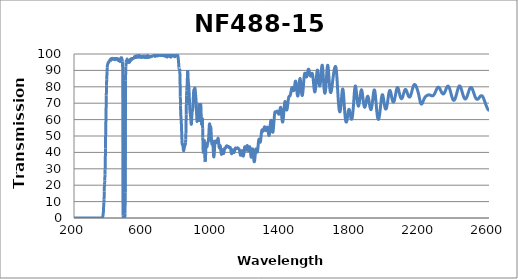
| Category | Transmission (%) |
|---|---|
| 2600.0 | 65.668 |
| 2599.0 | 65.684 |
| 2598.0 | 65.74 |
| 2597.0 | 65.794 |
| 2596.0 | 65.905 |
| 2595.0 | 66.047 |
| 2594.0 | 66.186 |
| 2593.0 | 66.374 |
| 2592.0 | 66.549 |
| 2591.0 | 66.769 |
| 2590.0 | 66.969 |
| 2589.0 | 67.181 |
| 2588.0 | 67.409 |
| 2587.0 | 67.704 |
| 2586.0 | 67.999 |
| 2585.0 | 68.207 |
| 2584.0 | 68.492 |
| 2583.0 | 68.764 |
| 2582.0 | 69.066 |
| 2581.0 | 69.389 |
| 2580.0 | 69.69 |
| 2579.0 | 69.988 |
| 2578.0 | 70.286 |
| 2577.0 | 70.584 |
| 2576.0 | 70.84 |
| 2575.0 | 71.145 |
| 2574.0 | 71.443 |
| 2573.0 | 71.683 |
| 2572.0 | 71.966 |
| 2571.0 | 72.23 |
| 2570.0 | 72.528 |
| 2569.0 | 72.798 |
| 2568.0 | 73.08 |
| 2567.0 | 73.34 |
| 2566.0 | 73.554 |
| 2565.0 | 73.762 |
| 2564.0 | 73.942 |
| 2563.0 | 74.112 |
| 2562.0 | 74.261 |
| 2561.0 | 74.375 |
| 2560.0 | 74.443 |
| 2559.0 | 74.502 |
| 2558.0 | 74.571 |
| 2557.0 | 74.596 |
| 2556.0 | 74.603 |
| 2555.0 | 74.603 |
| 2554.0 | 74.546 |
| 2553.0 | 74.491 |
| 2552.0 | 74.447 |
| 2551.0 | 74.345 |
| 2550.0 | 74.24 |
| 2549.0 | 74.157 |
| 2548.0 | 74.02 |
| 2547.0 | 73.843 |
| 2546.0 | 73.702 |
| 2545.0 | 73.576 |
| 2544.0 | 73.45 |
| 2543.0 | 73.312 |
| 2542.0 | 73.132 |
| 2541.0 | 72.984 |
| 2540.0 | 72.856 |
| 2539.0 | 72.773 |
| 2538.0 | 72.678 |
| 2537.0 | 72.597 |
| 2536.0 | 72.52 |
| 2535.0 | 72.45 |
| 2534.0 | 72.405 |
| 2533.0 | 72.385 |
| 2532.0 | 72.358 |
| 2531.0 | 72.353 |
| 2530.0 | 72.377 |
| 2529.0 | 72.429 |
| 2528.0 | 72.501 |
| 2527.0 | 72.619 |
| 2526.0 | 72.739 |
| 2525.0 | 72.878 |
| 2524.0 | 72.994 |
| 2523.0 | 73.16 |
| 2522.0 | 73.359 |
| 2521.0 | 73.58 |
| 2520.0 | 73.802 |
| 2519.0 | 74.068 |
| 2518.0 | 74.348 |
| 2517.0 | 74.641 |
| 2516.0 | 74.943 |
| 2515.0 | 75.262 |
| 2514.0 | 75.579 |
| 2513.0 | 75.898 |
| 2512.0 | 76.214 |
| 2511.0 | 76.527 |
| 2510.0 | 76.812 |
| 2509.0 | 77.129 |
| 2508.0 | 77.443 |
| 2507.0 | 77.738 |
| 2506.0 | 78.048 |
| 2505.0 | 78.302 |
| 2504.0 | 78.562 |
| 2503.0 | 78.792 |
| 2502.0 | 79.015 |
| 2501.0 | 79.195 |
| 2500.0 | 79.356 |
| 2499.0 | 79.455 |
| 2498.0 | 79.515 |
| 2497.0 | 79.581 |
| 2496.0 | 79.594 |
| 2495.0 | 79.607 |
| 2494.0 | 79.561 |
| 2493.0 | 79.493 |
| 2492.0 | 79.401 |
| 2491.0 | 79.265 |
| 2490.0 | 79.1 |
| 2489.0 | 78.941 |
| 2488.0 | 78.728 |
| 2487.0 | 78.483 |
| 2486.0 | 78.211 |
| 2485.0 | 77.928 |
| 2484.0 | 77.635 |
| 2483.0 | 77.314 |
| 2482.0 | 77.004 |
| 2481.0 | 76.682 |
| 2480.0 | 76.348 |
| 2479.0 | 76.006 |
| 2478.0 | 75.674 |
| 2477.0 | 75.333 |
| 2476.0 | 75.038 |
| 2475.0 | 74.734 |
| 2474.0 | 74.424 |
| 2473.0 | 74.117 |
| 2472.0 | 73.839 |
| 2471.0 | 73.573 |
| 2470.0 | 73.337 |
| 2469.0 | 73.155 |
| 2468.0 | 73.011 |
| 2467.0 | 72.866 |
| 2466.0 | 72.741 |
| 2465.0 | 72.637 |
| 2464.0 | 72.578 |
| 2463.0 | 72.577 |
| 2462.0 | 72.591 |
| 2461.0 | 72.631 |
| 2460.0 | 72.699 |
| 2459.0 | 72.811 |
| 2458.0 | 72.94 |
| 2457.0 | 73.11 |
| 2456.0 | 73.313 |
| 2455.0 | 73.518 |
| 2454.0 | 73.745 |
| 2453.0 | 74.009 |
| 2452.0 | 74.286 |
| 2451.0 | 74.601 |
| 2450.0 | 74.939 |
| 2449.0 | 75.282 |
| 2448.0 | 75.632 |
| 2447.0 | 75.988 |
| 2446.0 | 76.345 |
| 2445.0 | 76.72 |
| 2444.0 | 77.119 |
| 2443.0 | 77.505 |
| 2442.0 | 77.866 |
| 2441.0 | 78.23 |
| 2440.0 | 78.582 |
| 2439.0 | 78.904 |
| 2438.0 | 79.225 |
| 2437.0 | 79.519 |
| 2436.0 | 79.781 |
| 2435.0 | 80.007 |
| 2434.0 | 80.189 |
| 2433.0 | 80.339 |
| 2432.0 | 80.444 |
| 2431.0 | 80.52 |
| 2430.0 | 80.565 |
| 2429.0 | 80.544 |
| 2428.0 | 80.47 |
| 2427.0 | 80.347 |
| 2426.0 | 80.187 |
| 2425.0 | 80.012 |
| 2424.0 | 79.811 |
| 2423.0 | 79.557 |
| 2422.0 | 79.254 |
| 2421.0 | 78.933 |
| 2420.0 | 78.587 |
| 2419.0 | 78.217 |
| 2418.0 | 77.843 |
| 2417.0 | 77.45 |
| 2416.0 | 77.058 |
| 2415.0 | 76.661 |
| 2414.0 | 76.23 |
| 2413.0 | 75.806 |
| 2412.0 | 75.399 |
| 2411.0 | 75.019 |
| 2410.0 | 74.673 |
| 2409.0 | 74.315 |
| 2408.0 | 73.938 |
| 2407.0 | 73.595 |
| 2406.0 | 73.277 |
| 2405.0 | 72.981 |
| 2404.0 | 72.727 |
| 2403.0 | 72.512 |
| 2402.0 | 72.314 |
| 2401.0 | 72.12 |
| 2400.0 | 71.966 |
| 2399.0 | 71.87 |
| 2398.0 | 71.815 |
| 2397.0 | 71.79 |
| 2396.0 | 71.794 |
| 2395.0 | 71.832 |
| 2394.0 | 71.901 |
| 2393.0 | 72.006 |
| 2392.0 | 72.142 |
| 2391.0 | 72.322 |
| 2390.0 | 72.545 |
| 2389.0 | 72.805 |
| 2388.0 | 73.093 |
| 2387.0 | 73.394 |
| 2386.0 | 73.706 |
| 2385.0 | 74.043 |
| 2384.0 | 74.412 |
| 2383.0 | 74.787 |
| 2382.0 | 75.164 |
| 2381.0 | 75.565 |
| 2380.0 | 75.962 |
| 2379.0 | 76.368 |
| 2378.0 | 76.778 |
| 2377.0 | 77.186 |
| 2376.0 | 77.571 |
| 2375.0 | 77.932 |
| 2374.0 | 78.286 |
| 2373.0 | 78.638 |
| 2372.0 | 78.973 |
| 2371.0 | 79.287 |
| 2370.0 | 79.522 |
| 2369.0 | 79.723 |
| 2368.0 | 79.909 |
| 2367.0 | 80.077 |
| 2366.0 | 80.215 |
| 2365.0 | 80.334 |
| 2364.0 | 80.411 |
| 2363.0 | 80.437 |
| 2362.0 | 80.417 |
| 2361.0 | 80.37 |
| 2360.0 | 80.287 |
| 2359.0 | 80.184 |
| 2358.0 | 80.058 |
| 2357.0 | 79.887 |
| 2356.0 | 79.696 |
| 2355.0 | 79.484 |
| 2354.0 | 79.221 |
| 2353.0 | 78.97 |
| 2352.0 | 78.721 |
| 2351.0 | 78.455 |
| 2350.0 | 78.184 |
| 2349.0 | 77.905 |
| 2348.0 | 77.635 |
| 2347.0 | 77.384 |
| 2346.0 | 77.136 |
| 2345.0 | 76.896 |
| 2344.0 | 76.677 |
| 2343.0 | 76.468 |
| 2342.0 | 76.282 |
| 2341.0 | 76.125 |
| 2340.0 | 75.978 |
| 2339.0 | 75.867 |
| 2338.0 | 75.777 |
| 2337.0 | 75.701 |
| 2336.0 | 75.665 |
| 2335.0 | 75.641 |
| 2334.0 | 75.666 |
| 2333.0 | 75.715 |
| 2332.0 | 75.801 |
| 2331.0 | 75.889 |
| 2330.0 | 75.966 |
| 2329.0 | 76.085 |
| 2328.0 | 76.218 |
| 2327.0 | 76.397 |
| 2326.0 | 76.617 |
| 2325.0 | 76.819 |
| 2324.0 | 77.015 |
| 2323.0 | 77.222 |
| 2322.0 | 77.435 |
| 2321.0 | 77.662 |
| 2320.0 | 77.899 |
| 2319.0 | 78.158 |
| 2318.0 | 78.41 |
| 2317.0 | 78.622 |
| 2316.0 | 78.823 |
| 2315.0 | 78.999 |
| 2314.0 | 79.189 |
| 2313.0 | 79.346 |
| 2312.0 | 79.484 |
| 2311.0 | 79.628 |
| 2310.0 | 79.697 |
| 2309.0 | 79.741 |
| 2308.0 | 79.75 |
| 2307.0 | 79.758 |
| 2306.0 | 79.759 |
| 2305.0 | 79.703 |
| 2304.0 | 79.613 |
| 2303.0 | 79.542 |
| 2302.0 | 79.419 |
| 2301.0 | 79.265 |
| 2300.0 | 79.082 |
| 2299.0 | 78.914 |
| 2298.0 | 78.705 |
| 2297.0 | 78.472 |
| 2296.0 | 78.245 |
| 2295.0 | 78.013 |
| 2294.0 | 77.78 |
| 2293.0 | 77.56 |
| 2292.0 | 77.332 |
| 2291.0 | 77.077 |
| 2290.0 | 76.838 |
| 2289.0 | 76.574 |
| 2288.0 | 76.349 |
| 2287.0 | 76.118 |
| 2286.0 | 75.925 |
| 2285.0 | 75.739 |
| 2284.0 | 75.55 |
| 2283.0 | 75.338 |
| 2282.0 | 75.189 |
| 2281.0 | 75.037 |
| 2280.0 | 74.928 |
| 2279.0 | 74.804 |
| 2278.0 | 74.702 |
| 2277.0 | 74.629 |
| 2276.0 | 74.57 |
| 2275.0 | 74.517 |
| 2274.0 | 74.481 |
| 2273.0 | 74.467 |
| 2272.0 | 74.471 |
| 2271.0 | 74.454 |
| 2270.0 | 74.495 |
| 2269.0 | 74.492 |
| 2268.0 | 74.524 |
| 2267.0 | 74.583 |
| 2266.0 | 74.66 |
| 2265.0 | 74.712 |
| 2264.0 | 74.754 |
| 2263.0 | 74.83 |
| 2262.0 | 74.857 |
| 2261.0 | 74.913 |
| 2260.0 | 74.949 |
| 2259.0 | 74.973 |
| 2258.0 | 75.001 |
| 2257.0 | 75.016 |
| 2256.0 | 75.018 |
| 2255.0 | 75.04 |
| 2254.0 | 75.052 |
| 2253.0 | 75.081 |
| 2252.0 | 75.09 |
| 2251.0 | 75.042 |
| 2250.0 | 75.02 |
| 2249.0 | 74.996 |
| 2248.0 | 74.967 |
| 2247.0 | 74.963 |
| 2246.0 | 74.947 |
| 2245.0 | 74.889 |
| 2244.0 | 74.808 |
| 2243.0 | 74.766 |
| 2242.0 | 74.719 |
| 2241.0 | 74.674 |
| 2240.0 | 74.61 |
| 2239.0 | 74.554 |
| 2238.0 | 74.479 |
| 2237.0 | 74.382 |
| 2236.0 | 74.31 |
| 2235.0 | 74.235 |
| 2234.0 | 74.141 |
| 2233.0 | 74.039 |
| 2232.0 | 73.905 |
| 2231.0 | 73.759 |
| 2230.0 | 73.624 |
| 2229.0 | 73.452 |
| 2228.0 | 73.281 |
| 2227.0 | 73.106 |
| 2226.0 | 72.911 |
| 2225.0 | 72.695 |
| 2224.0 | 72.451 |
| 2223.0 | 72.182 |
| 2222.0 | 71.929 |
| 2221.0 | 71.682 |
| 2220.0 | 71.411 |
| 2219.0 | 71.13 |
| 2218.0 | 70.876 |
| 2217.0 | 70.608 |
| 2216.0 | 70.393 |
| 2215.0 | 70.158 |
| 2214.0 | 69.957 |
| 2213.0 | 69.779 |
| 2212.0 | 69.646 |
| 2211.0 | 69.523 |
| 2210.0 | 69.44 |
| 2209.0 | 69.437 |
| 2208.0 | 69.509 |
| 2207.0 | 69.62 |
| 2206.0 | 69.799 |
| 2205.0 | 70.027 |
| 2204.0 | 70.287 |
| 2203.0 | 70.636 |
| 2202.0 | 71.03 |
| 2201.0 | 71.459 |
| 2200.0 | 71.949 |
| 2199.0 | 72.453 |
| 2198.0 | 72.921 |
| 2197.0 | 73.437 |
| 2196.0 | 73.984 |
| 2195.0 | 74.483 |
| 2194.0 | 74.942 |
| 2193.0 | 75.407 |
| 2192.0 | 75.798 |
| 2191.0 | 76.24 |
| 2190.0 | 76.62 |
| 2189.0 | 77.04 |
| 2188.0 | 77.394 |
| 2187.0 | 77.769 |
| 2186.0 | 78.088 |
| 2185.0 | 78.403 |
| 2184.0 | 78.724 |
| 2183.0 | 79.033 |
| 2182.0 | 79.329 |
| 2181.0 | 79.635 |
| 2180.0 | 79.872 |
| 2179.0 | 80.127 |
| 2178.0 | 80.356 |
| 2177.0 | 80.603 |
| 2176.0 | 80.773 |
| 2175.0 | 80.943 |
| 2174.0 | 81.101 |
| 2173.0 | 81.223 |
| 2172.0 | 81.293 |
| 2171.0 | 81.336 |
| 2170.0 | 81.362 |
| 2169.0 | 81.354 |
| 2168.0 | 81.332 |
| 2167.0 | 81.277 |
| 2166.0 | 81.142 |
| 2165.0 | 80.98 |
| 2164.0 | 80.777 |
| 2163.0 | 80.548 |
| 2162.0 | 80.275 |
| 2161.0 | 79.961 |
| 2160.0 | 79.627 |
| 2159.0 | 79.245 |
| 2158.0 | 78.893 |
| 2157.0 | 78.51 |
| 2156.0 | 78.103 |
| 2155.0 | 77.69 |
| 2154.0 | 77.241 |
| 2153.0 | 76.831 |
| 2152.0 | 76.452 |
| 2151.0 | 76.052 |
| 2150.0 | 75.695 |
| 2149.0 | 75.327 |
| 2148.0 | 75.031 |
| 2147.0 | 74.747 |
| 2146.0 | 74.483 |
| 2145.0 | 74.26 |
| 2144.0 | 74.089 |
| 2143.0 | 73.972 |
| 2142.0 | 73.845 |
| 2141.0 | 73.766 |
| 2140.0 | 73.753 |
| 2139.0 | 73.754 |
| 2138.0 | 73.834 |
| 2137.0 | 73.928 |
| 2136.0 | 74.047 |
| 2135.0 | 74.218 |
| 2134.0 | 74.427 |
| 2133.0 | 74.636 |
| 2132.0 | 74.886 |
| 2131.0 | 75.17 |
| 2130.0 | 75.484 |
| 2129.0 | 75.755 |
| 2128.0 | 76.033 |
| 2127.0 | 76.312 |
| 2126.0 | 76.631 |
| 2125.0 | 76.982 |
| 2124.0 | 77.257 |
| 2123.0 | 77.508 |
| 2122.0 | 77.75 |
| 2121.0 | 77.967 |
| 2120.0 | 78.139 |
| 2119.0 | 78.25 |
| 2118.0 | 78.327 |
| 2117.0 | 78.381 |
| 2116.0 | 78.333 |
| 2115.0 | 78.265 |
| 2114.0 | 78.133 |
| 2113.0 | 77.955 |
| 2112.0 | 77.753 |
| 2111.0 | 77.489 |
| 2110.0 | 77.206 |
| 2109.0 | 76.863 |
| 2108.0 | 76.499 |
| 2107.0 | 76.132 |
| 2106.0 | 75.786 |
| 2105.0 | 75.396 |
| 2104.0 | 75.026 |
| 2103.0 | 74.631 |
| 2102.0 | 74.28 |
| 2101.0 | 73.951 |
| 2100.0 | 73.668 |
| 2099.0 | 73.406 |
| 2098.0 | 73.187 |
| 2097.0 | 72.988 |
| 2096.0 | 72.863 |
| 2095.0 | 72.768 |
| 2094.0 | 72.744 |
| 2093.0 | 72.778 |
| 2092.0 | 72.842 |
| 2091.0 | 72.946 |
| 2090.0 | 73.11 |
| 2089.0 | 73.337 |
| 2088.0 | 73.581 |
| 2087.0 | 73.88 |
| 2086.0 | 74.223 |
| 2085.0 | 74.621 |
| 2084.0 | 75.032 |
| 2083.0 | 75.495 |
| 2082.0 | 75.916 |
| 2081.0 | 76.379 |
| 2080.0 | 76.861 |
| 2079.0 | 77.328 |
| 2078.0 | 77.766 |
| 2077.0 | 78.173 |
| 2076.0 | 78.551 |
| 2075.0 | 78.884 |
| 2074.0 | 79.144 |
| 2073.0 | 79.345 |
| 2072.0 | 79.482 |
| 2071.0 | 79.532 |
| 2070.0 | 79.486 |
| 2069.0 | 79.382 |
| 2068.0 | 79.182 |
| 2067.0 | 78.9 |
| 2066.0 | 78.563 |
| 2065.0 | 78.164 |
| 2064.0 | 77.702 |
| 2063.0 | 77.195 |
| 2062.0 | 76.643 |
| 2061.0 | 76.087 |
| 2060.0 | 75.527 |
| 2059.0 | 74.936 |
| 2058.0 | 74.354 |
| 2057.0 | 73.763 |
| 2056.0 | 73.213 |
| 2055.0 | 72.724 |
| 2054.0 | 72.28 |
| 2053.0 | 71.877 |
| 2052.0 | 71.514 |
| 2051.0 | 71.207 |
| 2050.0 | 70.974 |
| 2049.0 | 70.807 |
| 2048.0 | 70.706 |
| 2047.0 | 70.681 |
| 2046.0 | 70.728 |
| 2045.0 | 70.828 |
| 2044.0 | 70.99 |
| 2043.0 | 71.229 |
| 2042.0 | 71.564 |
| 2041.0 | 71.964 |
| 2040.0 | 72.373 |
| 2039.0 | 72.804 |
| 2038.0 | 73.291 |
| 2037.0 | 73.838 |
| 2036.0 | 74.394 |
| 2035.0 | 74.951 |
| 2034.0 | 75.496 |
| 2033.0 | 75.995 |
| 2032.0 | 76.455 |
| 2031.0 | 76.88 |
| 2030.0 | 77.24 |
| 2029.0 | 77.514 |
| 2028.0 | 77.678 |
| 2027.0 | 77.752 |
| 2026.0 | 77.738 |
| 2025.0 | 77.61 |
| 2024.0 | 77.377 |
| 2023.0 | 77.023 |
| 2022.0 | 76.601 |
| 2021.0 | 76.101 |
| 2020.0 | 75.484 |
| 2019.0 | 74.814 |
| 2018.0 | 74.086 |
| 2017.0 | 73.353 |
| 2016.0 | 72.628 |
| 2015.0 | 71.869 |
| 2014.0 | 71.135 |
| 2013.0 | 70.429 |
| 2012.0 | 69.724 |
| 2011.0 | 69.092 |
| 2010.0 | 68.511 |
| 2009.0 | 67.971 |
| 2008.0 | 67.482 |
| 2007.0 | 67.081 |
| 2006.0 | 66.787 |
| 2005.0 | 66.577 |
| 2004.0 | 66.451 |
| 2003.0 | 66.411 |
| 2002.0 | 66.443 |
| 2001.0 | 66.57 |
| 2000.0 | 66.825 |
| 1999.0 | 67.154 |
| 1998.0 | 67.552 |
| 1997.0 | 68.035 |
| 1996.0 | 68.593 |
| 1995.0 | 69.219 |
| 1994.0 | 69.916 |
| 1993.0 | 70.61 |
| 1992.0 | 71.302 |
| 1991.0 | 72.007 |
| 1990.0 | 72.705 |
| 1989.0 | 73.356 |
| 1988.0 | 73.923 |
| 1987.0 | 74.413 |
| 1986.0 | 74.78 |
| 1985.0 | 75.044 |
| 1984.0 | 75.189 |
| 1983.0 | 75.171 |
| 1982.0 | 75.013 |
| 1981.0 | 74.716 |
| 1980.0 | 74.256 |
| 1979.0 | 73.673 |
| 1978.0 | 72.961 |
| 1977.0 | 72.16 |
| 1976.0 | 71.307 |
| 1975.0 | 70.389 |
| 1974.0 | 69.395 |
| 1973.0 | 68.4 |
| 1972.0 | 67.378 |
| 1971.0 | 66.396 |
| 1970.0 | 65.437 |
| 1969.0 | 64.462 |
| 1968.0 | 63.603 |
| 1967.0 | 62.855 |
| 1966.0 | 62.152 |
| 1965.0 | 61.512 |
| 1964.0 | 60.993 |
| 1963.0 | 60.61 |
| 1962.0 | 60.305 |
| 1961.0 | 60.127 |
| 1960.0 | 60.089 |
| 1959.0 | 60.185 |
| 1958.0 | 60.365 |
| 1957.0 | 60.717 |
| 1956.0 | 61.168 |
| 1955.0 | 61.759 |
| 1954.0 | 62.504 |
| 1953.0 | 63.325 |
| 1952.0 | 64.228 |
| 1951.0 | 65.226 |
| 1950.0 | 66.382 |
| 1949.0 | 67.595 |
| 1948.0 | 68.763 |
| 1947.0 | 70.041 |
| 1946.0 | 71.328 |
| 1945.0 | 72.52 |
| 1944.0 | 73.735 |
| 1943.0 | 74.823 |
| 1942.0 | 75.745 |
| 1941.0 | 76.58 |
| 1940.0 | 77.257 |
| 1939.0 | 77.733 |
| 1938.0 | 78.002 |
| 1937.0 | 78.089 |
| 1936.0 | 78.019 |
| 1935.0 | 77.768 |
| 1934.0 | 77.332 |
| 1933.0 | 76.784 |
| 1932.0 | 76.084 |
| 1931.0 | 75.309 |
| 1930.0 | 74.48 |
| 1929.0 | 73.555 |
| 1928.0 | 72.573 |
| 1927.0 | 71.614 |
| 1926.0 | 70.672 |
| 1925.0 | 69.784 |
| 1924.0 | 69.03 |
| 1923.0 | 68.365 |
| 1922.0 | 67.773 |
| 1921.0 | 67.186 |
| 1920.0 | 66.686 |
| 1919.0 | 66.328 |
| 1918.0 | 66.101 |
| 1917.0 | 66.054 |
| 1916.0 | 66.182 |
| 1915.0 | 66.422 |
| 1914.0 | 66.701 |
| 1913.0 | 67.066 |
| 1912.0 | 67.468 |
| 1911.0 | 67.966 |
| 1910.0 | 68.59 |
| 1909.0 | 69.235 |
| 1908.0 | 69.917 |
| 1907.0 | 70.622 |
| 1906.0 | 71.406 |
| 1905.0 | 72.031 |
| 1904.0 | 72.634 |
| 1903.0 | 73.125 |
| 1902.0 | 73.596 |
| 1901.0 | 73.953 |
| 1900.0 | 74.186 |
| 1899.0 | 74.284 |
| 1898.0 | 74.216 |
| 1897.0 | 74.049 |
| 1896.0 | 73.842 |
| 1895.0 | 73.58 |
| 1894.0 | 73.238 |
| 1893.0 | 72.776 |
| 1892.0 | 72.196 |
| 1891.0 | 71.53 |
| 1890.0 | 70.83 |
| 1889.0 | 70.18 |
| 1888.0 | 69.601 |
| 1887.0 | 69.136 |
| 1886.0 | 68.728 |
| 1885.0 | 68.347 |
| 1884.0 | 68.001 |
| 1883.0 | 67.697 |
| 1882.0 | 67.556 |
| 1881.0 | 67.513 |
| 1880.0 | 67.587 |
| 1879.0 | 67.835 |
| 1878.0 | 68.161 |
| 1877.0 | 68.652 |
| 1876.0 | 69.173 |
| 1875.0 | 69.792 |
| 1874.0 | 70.5 |
| 1873.0 | 71.316 |
| 1872.0 | 72.194 |
| 1871.0 | 73.04 |
| 1870.0 | 73.936 |
| 1869.0 | 74.881 |
| 1868.0 | 75.687 |
| 1867.0 | 76.447 |
| 1866.0 | 77.036 |
| 1865.0 | 77.549 |
| 1864.0 | 77.874 |
| 1863.0 | 78.126 |
| 1862.0 | 78.17 |
| 1861.0 | 78.024 |
| 1860.0 | 77.619 |
| 1859.0 | 77.131 |
| 1858.0 | 76.512 |
| 1857.0 | 75.818 |
| 1856.0 | 75.081 |
| 1855.0 | 74.251 |
| 1854.0 | 73.433 |
| 1853.0 | 72.555 |
| 1852.0 | 71.7 |
| 1851.0 | 70.897 |
| 1850.0 | 70.329 |
| 1849.0 | 69.826 |
| 1848.0 | 69.312 |
| 1847.0 | 68.76 |
| 1846.0 | 68.371 |
| 1845.0 | 68.191 |
| 1844.0 | 68.25 |
| 1843.0 | 68.532 |
| 1842.0 | 68.973 |
| 1841.0 | 69.434 |
| 1840.0 | 70.051 |
| 1839.0 | 70.696 |
| 1838.0 | 71.469 |
| 1837.0 | 72.413 |
| 1836.0 | 73.612 |
| 1835.0 | 74.806 |
| 1834.0 | 75.888 |
| 1833.0 | 76.911 |
| 1832.0 | 77.939 |
| 1831.0 | 78.846 |
| 1830.0 | 79.611 |
| 1829.0 | 80.2 |
| 1828.0 | 80.477 |
| 1827.0 | 80.516 |
| 1826.0 | 80.303 |
| 1825.0 | 79.882 |
| 1824.0 | 79.153 |
| 1823.0 | 78.42 |
| 1822.0 | 77.413 |
| 1821.0 | 76.006 |
| 1820.0 | 74.417 |
| 1819.0 | 72.777 |
| 1818.0 | 71.307 |
| 1817.0 | 69.949 |
| 1816.0 | 68.521 |
| 1815.0 | 67.139 |
| 1814.0 | 65.847 |
| 1813.0 | 64.69 |
| 1812.0 | 63.616 |
| 1811.0 | 62.69 |
| 1810.0 | 61.85 |
| 1809.0 | 61.175 |
| 1808.0 | 60.754 |
| 1807.0 | 60.426 |
| 1806.0 | 60.236 |
| 1805.0 | 60.175 |
| 1804.0 | 60.248 |
| 1803.0 | 60.442 |
| 1802.0 | 60.755 |
| 1801.0 | 61.234 |
| 1800.0 | 61.786 |
| 1799.0 | 62.359 |
| 1798.0 | 62.982 |
| 1797.0 | 63.637 |
| 1796.0 | 64.226 |
| 1795.0 | 64.818 |
| 1794.0 | 65.339 |
| 1793.0 | 65.742 |
| 1792.0 | 66.046 |
| 1791.0 | 66.214 |
| 1790.0 | 66.214 |
| 1789.0 | 66.049 |
| 1788.0 | 65.74 |
| 1787.0 | 65.292 |
| 1786.0 | 64.747 |
| 1785.0 | 64.049 |
| 1784.0 | 63.314 |
| 1783.0 | 62.589 |
| 1782.0 | 61.814 |
| 1781.0 | 61.111 |
| 1780.0 | 60.439 |
| 1779.0 | 59.795 |
| 1778.0 | 59.25 |
| 1777.0 | 58.858 |
| 1776.0 | 58.606 |
| 1775.0 | 58.469 |
| 1774.0 | 58.502 |
| 1773.0 | 58.665 |
| 1772.0 | 58.986 |
| 1771.0 | 59.456 |
| 1770.0 | 60.1 |
| 1769.0 | 60.931 |
| 1768.0 | 61.905 |
| 1767.0 | 63.047 |
| 1766.0 | 64.348 |
| 1765.0 | 65.75 |
| 1764.0 | 67.262 |
| 1763.0 | 68.83 |
| 1762.0 | 70.424 |
| 1761.0 | 72.059 |
| 1760.0 | 73.65 |
| 1759.0 | 75.048 |
| 1758.0 | 76.316 |
| 1757.0 | 77.356 |
| 1756.0 | 78.092 |
| 1755.0 | 78.536 |
| 1754.0 | 78.682 |
| 1753.0 | 78.498 |
| 1752.0 | 78.019 |
| 1751.0 | 77.249 |
| 1750.0 | 76.276 |
| 1749.0 | 75.131 |
| 1748.0 | 73.877 |
| 1747.0 | 72.591 |
| 1746.0 | 71.284 |
| 1745.0 | 70.004 |
| 1744.0 | 68.76 |
| 1743.0 | 67.707 |
| 1742.0 | 66.763 |
| 1741.0 | 65.994 |
| 1740.0 | 65.391 |
| 1739.0 | 65.022 |
| 1738.0 | 64.773 |
| 1737.0 | 64.738 |
| 1736.0 | 64.916 |
| 1735.0 | 65.256 |
| 1734.0 | 65.772 |
| 1733.0 | 66.501 |
| 1732.0 | 67.404 |
| 1731.0 | 68.424 |
| 1730.0 | 69.666 |
| 1729.0 | 71.076 |
| 1728.0 | 72.628 |
| 1727.0 | 74.28 |
| 1726.0 | 76.017 |
| 1725.0 | 77.742 |
| 1724.0 | 79.532 |
| 1723.0 | 81.346 |
| 1722.0 | 83.107 |
| 1721.0 | 84.74 |
| 1720.0 | 86.3 |
| 1719.0 | 87.687 |
| 1718.0 | 88.922 |
| 1717.0 | 89.976 |
| 1716.0 | 90.817 |
| 1715.0 | 91.487 |
| 1714.0 | 91.993 |
| 1713.0 | 92.285 |
| 1712.0 | 92.404 |
| 1711.0 | 92.38 |
| 1710.0 | 92.208 |
| 1709.0 | 91.98 |
| 1708.0 | 91.652 |
| 1707.0 | 91.255 |
| 1706.0 | 90.823 |
| 1705.0 | 90.295 |
| 1704.0 | 89.717 |
| 1703.0 | 89.09 |
| 1702.0 | 88.41 |
| 1701.0 | 87.707 |
| 1700.0 | 86.95 |
| 1699.0 | 86.154 |
| 1698.0 | 85.308 |
| 1697.0 | 84.449 |
| 1696.0 | 83.544 |
| 1695.0 | 82.655 |
| 1694.0 | 81.807 |
| 1693.0 | 80.933 |
| 1692.0 | 80.081 |
| 1691.0 | 79.272 |
| 1690.0 | 78.526 |
| 1689.0 | 77.875 |
| 1688.0 | 77.325 |
| 1687.0 | 76.891 |
| 1686.0 | 76.591 |
| 1685.0 | 76.471 |
| 1684.0 | 76.521 |
| 1683.0 | 76.713 |
| 1682.0 | 77.12 |
| 1681.0 | 77.71 |
| 1680.0 | 78.481 |
| 1679.0 | 79.445 |
| 1678.0 | 80.588 |
| 1677.0 | 81.905 |
| 1676.0 | 83.351 |
| 1675.0 | 84.872 |
| 1674.0 | 86.44 |
| 1673.0 | 87.967 |
| 1672.0 | 89.353 |
| 1671.0 | 90.642 |
| 1670.0 | 91.721 |
| 1669.0 | 92.543 |
| 1668.0 | 93.033 |
| 1667.0 | 93.094 |
| 1666.0 | 92.807 |
| 1665.0 | 92.171 |
| 1664.0 | 91.174 |
| 1663.0 | 89.917 |
| 1662.0 | 88.474 |
| 1661.0 | 86.907 |
| 1660.0 | 85.298 |
| 1659.0 | 83.653 |
| 1658.0 | 82.041 |
| 1657.0 | 80.547 |
| 1656.0 | 79.25 |
| 1655.0 | 78.179 |
| 1654.0 | 77.28 |
| 1653.0 | 76.622 |
| 1652.0 | 76.204 |
| 1651.0 | 76.047 |
| 1650.0 | 76.169 |
| 1649.0 | 76.57 |
| 1648.0 | 77.24 |
| 1647.0 | 78.152 |
| 1646.0 | 79.264 |
| 1645.0 | 80.585 |
| 1644.0 | 82.1 |
| 1643.0 | 83.753 |
| 1642.0 | 85.474 |
| 1641.0 | 87.204 |
| 1640.0 | 88.866 |
| 1639.0 | 90.344 |
| 1638.0 | 91.559 |
| 1637.0 | 92.475 |
| 1636.0 | 93.036 |
| 1635.0 | 93.203 |
| 1634.0 | 92.979 |
| 1633.0 | 92.359 |
| 1632.0 | 91.452 |
| 1631.0 | 90.311 |
| 1630.0 | 88.966 |
| 1629.0 | 87.541 |
| 1628.0 | 86.119 |
| 1627.0 | 84.735 |
| 1626.0 | 83.45 |
| 1625.0 | 82.382 |
| 1624.0 | 81.564 |
| 1623.0 | 80.949 |
| 1622.0 | 80.568 |
| 1621.0 | 80.454 |
| 1620.0 | 80.592 |
| 1619.0 | 80.962 |
| 1618.0 | 81.542 |
| 1617.0 | 82.33 |
| 1616.0 | 83.284 |
| 1615.0 | 84.373 |
| 1614.0 | 85.475 |
| 1613.0 | 86.625 |
| 1612.0 | 87.694 |
| 1611.0 | 88.633 |
| 1610.0 | 89.434 |
| 1609.0 | 89.96 |
| 1608.0 | 90.172 |
| 1607.0 | 90.087 |
| 1606.0 | 89.722 |
| 1605.0 | 89.071 |
| 1604.0 | 88.128 |
| 1603.0 | 86.96 |
| 1602.0 | 85.646 |
| 1601.0 | 84.229 |
| 1600.0 | 82.834 |
| 1599.0 | 81.462 |
| 1598.0 | 80.177 |
| 1597.0 | 79.082 |
| 1596.0 | 78.186 |
| 1595.0 | 77.506 |
| 1594.0 | 77.059 |
| 1593.0 | 76.872 |
| 1592.0 | 76.902 |
| 1591.0 | 77.175 |
| 1590.0 | 77.693 |
| 1589.0 | 78.425 |
| 1588.0 | 79.315 |
| 1587.0 | 80.415 |
| 1586.0 | 81.497 |
| 1585.0 | 82.638 |
| 1584.0 | 83.776 |
| 1583.0 | 84.858 |
| 1582.0 | 85.848 |
| 1581.0 | 86.7 |
| 1580.0 | 87.352 |
| 1579.0 | 87.838 |
| 1578.0 | 88.117 |
| 1577.0 | 88.217 |
| 1576.0 | 88.201 |
| 1575.0 | 88.037 |
| 1574.0 | 87.763 |
| 1573.0 | 87.427 |
| 1572.0 | 87.106 |
| 1571.0 | 86.853 |
| 1570.0 | 86.665 |
| 1569.0 | 86.526 |
| 1568.0 | 86.478 |
| 1567.0 | 86.578 |
| 1566.0 | 86.784 |
| 1565.0 | 87.134 |
| 1564.0 | 87.579 |
| 1563.0 | 88.083 |
| 1562.0 | 88.63 |
| 1561.0 | 89.165 |
| 1560.0 | 89.713 |
| 1559.0 | 90.175 |
| 1558.0 | 90.524 |
| 1557.0 | 90.716 |
| 1556.0 | 90.764 |
| 1555.0 | 90.652 |
| 1554.0 | 90.382 |
| 1553.0 | 89.963 |
| 1552.0 | 89.419 |
| 1551.0 | 88.832 |
| 1550.0 | 88.186 |
| 1549.0 | 87.565 |
| 1548.0 | 87.015 |
| 1547.0 | 86.554 |
| 1546.0 | 86.222 |
| 1545.0 | 86.021 |
| 1544.0 | 85.994 |
| 1543.0 | 86.077 |
| 1542.0 | 86.283 |
| 1541.0 | 86.598 |
| 1540.0 | 86.968 |
| 1539.0 | 87.404 |
| 1538.0 | 87.806 |
| 1537.0 | 88.104 |
| 1536.0 | 88.281 |
| 1535.0 | 88.288 |
| 1534.0 | 88.09 |
| 1533.0 | 87.674 |
| 1532.0 | 87.017 |
| 1531.0 | 86.175 |
| 1530.0 | 85.158 |
| 1529.0 | 83.89 |
| 1528.0 | 82.549 |
| 1527.0 | 81.111 |
| 1526.0 | 79.773 |
| 1525.0 | 78.476 |
| 1524.0 | 77.291 |
| 1523.0 | 76.287 |
| 1522.0 | 75.509 |
| 1521.0 | 74.967 |
| 1520.0 | 74.698 |
| 1519.0 | 74.743 |
| 1518.0 | 75.056 |
| 1517.0 | 75.621 |
| 1516.0 | 76.427 |
| 1515.0 | 77.444 |
| 1514.0 | 78.628 |
| 1513.0 | 79.94 |
| 1512.0 | 81.255 |
| 1511.0 | 82.474 |
| 1510.0 | 83.544 |
| 1509.0 | 84.408 |
| 1508.0 | 84.927 |
| 1507.0 | 85.049 |
| 1506.0 | 84.847 |
| 1505.0 | 84.336 |
| 1504.0 | 83.499 |
| 1503.0 | 82.419 |
| 1502.0 | 81.186 |
| 1501.0 | 79.865 |
| 1500.0 | 78.571 |
| 1499.0 | 77.376 |
| 1498.0 | 76.332 |
| 1497.0 | 75.455 |
| 1496.0 | 74.835 |
| 1495.0 | 74.446 |
| 1494.0 | 74.333 |
| 1493.0 | 74.482 |
| 1492.0 | 74.862 |
| 1491.0 | 75.487 |
| 1490.0 | 76.293 |
| 1489.0 | 77.264 |
| 1488.0 | 78.299 |
| 1487.0 | 79.415 |
| 1486.0 | 80.517 |
| 1485.0 | 81.566 |
| 1484.0 | 82.39 |
| 1483.0 | 83.025 |
| 1482.0 | 83.372 |
| 1481.0 | 83.446 |
| 1480.0 | 83.275 |
| 1479.0 | 82.81 |
| 1478.0 | 82.21 |
| 1477.0 | 81.484 |
| 1476.0 | 80.69 |
| 1475.0 | 79.866 |
| 1474.0 | 79.123 |
| 1473.0 | 78.554 |
| 1472.0 | 78.123 |
| 1471.0 | 77.811 |
| 1470.0 | 77.649 |
| 1469.0 | 77.664 |
| 1468.0 | 77.776 |
| 1467.0 | 78.101 |
| 1466.0 | 78.434 |
| 1465.0 | 78.809 |
| 1464.0 | 79.108 |
| 1463.0 | 79.348 |
| 1462.0 | 79.505 |
| 1461.0 | 79.501 |
| 1460.0 | 79.369 |
| 1459.0 | 79.096 |
| 1458.0 | 78.683 |
| 1457.0 | 78.151 |
| 1456.0 | 77.546 |
| 1455.0 | 76.972 |
| 1454.0 | 76.392 |
| 1453.0 | 75.841 |
| 1452.0 | 75.373 |
| 1451.0 | 74.983 |
| 1450.0 | 74.686 |
| 1449.0 | 74.487 |
| 1448.0 | 74.376 |
| 1447.0 | 74.324 |
| 1446.0 | 74.358 |
| 1445.0 | 74.289 |
| 1444.0 | 74.164 |
| 1443.0 | 73.991 |
| 1442.0 | 73.686 |
| 1441.0 | 73.246 |
| 1440.0 | 72.675 |
| 1439.0 | 71.916 |
| 1438.0 | 71.109 |
| 1437.0 | 70.161 |
| 1436.0 | 69.17 |
| 1435.0 | 68.268 |
| 1434.0 | 67.447 |
| 1433.0 | 66.731 |
| 1432.0 | 66.238 |
| 1431.0 | 65.886 |
| 1430.0 | 65.775 |
| 1429.0 | 65.891 |
| 1428.0 | 66.256 |
| 1427.0 | 66.8 |
| 1426.0 | 67.512 |
| 1425.0 | 68.307 |
| 1424.0 | 69.121 |
| 1423.0 | 69.874 |
| 1422.0 | 70.497 |
| 1421.0 | 70.898 |
| 1420.0 | 71.011 |
| 1419.0 | 70.787 |
| 1418.0 | 70.094 |
| 1417.0 | 69.138 |
| 1416.0 | 68.068 |
| 1415.0 | 66.91 |
| 1414.0 | 65.514 |
| 1413.0 | 63.923 |
| 1412.0 | 62.494 |
| 1411.0 | 61.289 |
| 1410.0 | 60.313 |
| 1409.0 | 59.518 |
| 1408.0 | 58.905 |
| 1407.0 | 58.532 |
| 1406.0 | 58.498 |
| 1405.0 | 58.78 |
| 1404.0 | 59.354 |
| 1403.0 | 60.149 |
| 1402.0 | 61.12 |
| 1401.0 | 62.289 |
| 1400.0 | 63.449 |
| 1399.0 | 64.616 |
| 1398.0 | 65.485 |
| 1397.0 | 66.353 |
| 1396.0 | 67.165 |
| 1395.0 | 67.438 |
| 1394.0 | 67.364 |
| 1393.0 | 67.098 |
| 1392.0 | 66.719 |
| 1391.0 | 66.101 |
| 1390.0 | 65.498 |
| 1389.0 | 64.946 |
| 1388.0 | 64.408 |
| 1387.0 | 63.866 |
| 1386.0 | 63.467 |
| 1385.0 | 63.291 |
| 1384.0 | 63.298 |
| 1383.0 | 63.483 |
| 1382.0 | 63.67 |
| 1381.0 | 63.85 |
| 1380.0 | 64.105 |
| 1379.0 | 64.388 |
| 1378.0 | 64.729 |
| 1377.0 | 64.994 |
| 1376.0 | 65.151 |
| 1375.0 | 65.207 |
| 1374.0 | 65.146 |
| 1373.0 | 65.043 |
| 1372.0 | 64.921 |
| 1371.0 | 64.756 |
| 1370.0 | 64.623 |
| 1369.0 | 64.537 |
| 1368.0 | 64.554 |
| 1367.0 | 64.613 |
| 1366.0 | 64.672 |
| 1365.0 | 64.757 |
| 1364.0 | 64.815 |
| 1363.0 | 64.779 |
| 1362.0 | 64.557 |
| 1361.0 | 64.038 |
| 1360.0 | 63.273 |
| 1359.0 | 62.253 |
| 1358.0 | 61.076 |
| 1357.0 | 59.821 |
| 1356.0 | 58.414 |
| 1355.0 | 57.063 |
| 1354.0 | 55.64 |
| 1353.0 | 54.304 |
| 1352.0 | 53.309 |
| 1351.0 | 52.563 |
| 1350.0 | 52.239 |
| 1349.0 | 52.23 |
| 1348.0 | 52.476 |
| 1347.0 | 53.007 |
| 1346.0 | 53.77 |
| 1345.0 | 54.788 |
| 1344.0 | 55.97 |
| 1343.0 | 57.105 |
| 1342.0 | 58.106 |
| 1341.0 | 58.933 |
| 1340.0 | 59.462 |
| 1339.0 | 59.58 |
| 1338.0 | 59.281 |
| 1337.0 | 58.605 |
| 1336.0 | 57.616 |
| 1335.0 | 56.401 |
| 1334.0 | 55.112 |
| 1333.0 | 53.816 |
| 1332.0 | 52.721 |
| 1331.0 | 51.731 |
| 1330.0 | 50.999 |
| 1329.0 | 50.522 |
| 1328.0 | 50.339 |
| 1327.0 | 50.422 |
| 1326.0 | 50.755 |
| 1325.0 | 51.317 |
| 1324.0 | 52.021 |
| 1323.0 | 52.808 |
| 1322.0 | 53.629 |
| 1321.0 | 54.374 |
| 1320.0 | 54.978 |
| 1319.0 | 55.343 |
| 1318.0 | 55.456 |
| 1317.0 | 55.349 |
| 1316.0 | 55.047 |
| 1315.0 | 54.643 |
| 1314.0 | 54.204 |
| 1313.0 | 53.801 |
| 1312.0 | 53.503 |
| 1311.0 | 53.329 |
| 1310.0 | 53.309 |
| 1309.0 | 53.47 |
| 1308.0 | 53.788 |
| 1307.0 | 54.216 |
| 1306.0 | 54.657 |
| 1305.0 | 55.065 |
| 1304.0 | 55.364 |
| 1303.0 | 55.548 |
| 1302.0 | 55.559 |
| 1301.0 | 55.403 |
| 1300.0 | 55.102 |
| 1299.0 | 54.671 |
| 1298.0 | 54.217 |
| 1297.0 | 53.767 |
| 1296.0 | 53.362 |
| 1295.0 | 53.07 |
| 1294.0 | 52.915 |
| 1293.0 | 52.87 |
| 1292.0 | 52.951 |
| 1291.0 | 53.157 |
| 1290.0 | 53.411 |
| 1289.0 | 53.639 |
| 1288.0 | 53.761 |
| 1287.0 | 53.7 |
| 1286.0 | 53.405 |
| 1285.0 | 52.841 |
| 1284.0 | 52.055 |
| 1283.0 | 51.092 |
| 1282.0 | 50.016 |
| 1281.0 | 48.949 |
| 1280.0 | 47.956 |
| 1279.0 | 47.112 |
| 1278.0 | 46.549 |
| 1277.0 | 46.234 |
| 1276.0 | 46.169 |
| 1275.0 | 46.331 |
| 1274.0 | 46.691 |
| 1273.0 | 47.149 |
| 1272.0 | 47.602 |
| 1271.0 | 47.956 |
| 1270.0 | 48.085 |
| 1269.0 | 47.909 |
| 1268.0 | 47.401 |
| 1267.0 | 46.603 |
| 1266.0 | 45.55 |
| 1265.0 | 44.34 |
| 1264.0 | 43.176 |
| 1263.0 | 42.142 |
| 1262.0 | 41.245 |
| 1261.0 | 40.595 |
| 1260.0 | 40.223 |
| 1259.0 | 40.09 |
| 1258.0 | 40.211 |
| 1257.0 | 40.548 |
| 1256.0 | 41.007 |
| 1255.0 | 41.505 |
| 1254.0 | 41.932 |
| 1253.0 | 42.139 |
| 1252.0 | 42.037 |
| 1251.0 | 41.597 |
| 1250.0 | 40.827 |
| 1249.0 | 39.804 |
| 1248.0 | 38.61 |
| 1247.0 | 37.388 |
| 1246.0 | 36.263 |
| 1245.0 | 35.31 |
| 1244.0 | 34.624 |
| 1243.0 | 34.269 |
| 1242.0 | 34.287 |
| 1241.0 | 34.665 |
| 1240.0 | 35.391 |
| 1239.0 | 36.423 |
| 1238.0 | 37.631 |
| 1237.0 | 38.949 |
| 1236.0 | 40.249 |
| 1235.0 | 41.3 |
| 1234.0 | 41.958 |
| 1233.0 | 42.146 |
| 1232.0 | 41.829 |
| 1231.0 | 41.122 |
| 1230.0 | 40.181 |
| 1229.0 | 39.167 |
| 1228.0 | 38.256 |
| 1227.0 | 37.57 |
| 1226.0 | 37.167 |
| 1225.0 | 37.085 |
| 1224.0 | 37.35 |
| 1223.0 | 37.94 |
| 1222.0 | 38.83 |
| 1221.0 | 39.864 |
| 1220.0 | 40.958 |
| 1219.0 | 41.97 |
| 1218.0 | 42.773 |
| 1217.0 | 43.289 |
| 1216.0 | 43.464 |
| 1215.0 | 43.326 |
| 1214.0 | 42.922 |
| 1213.0 | 42.37 |
| 1212.0 | 41.803 |
| 1211.0 | 41.337 |
| 1210.0 | 41.05 |
| 1209.0 | 40.989 |
| 1208.0 | 41.186 |
| 1207.0 | 41.575 |
| 1206.0 | 42.117 |
| 1205.0 | 42.776 |
| 1204.0 | 43.418 |
| 1203.0 | 43.908 |
| 1202.0 | 44.161 |
| 1201.0 | 44.112 |
| 1200.0 | 43.789 |
| 1199.0 | 43.289 |
| 1198.0 | 42.642 |
| 1197.0 | 42.037 |
| 1196.0 | 41.578 |
| 1195.0 | 41.318 |
| 1194.0 | 41.297 |
| 1193.0 | 41.519 |
| 1192.0 | 41.936 |
| 1191.0 | 42.457 |
| 1190.0 | 42.974 |
| 1189.0 | 43.359 |
| 1188.0 | 43.481 |
| 1187.0 | 43.266 |
| 1186.0 | 42.726 |
| 1185.0 | 41.923 |
| 1184.0 | 40.97 |
| 1183.0 | 39.971 |
| 1182.0 | 39.06 |
| 1181.0 | 38.354 |
| 1180.0 | 37.883 |
| 1179.0 | 37.708 |
| 1178.0 | 37.822 |
| 1177.0 | 38.186 |
| 1176.0 | 38.748 |
| 1175.0 | 39.4 |
| 1174.0 | 40.08 |
| 1173.0 | 40.63 |
| 1172.0 | 40.987 |
| 1171.0 | 41.085 |
| 1170.0 | 40.915 |
| 1169.0 | 40.518 |
| 1168.0 | 39.961 |
| 1167.0 | 39.377 |
| 1166.0 | 38.836 |
| 1165.0 | 38.408 |
| 1164.0 | 38.209 |
| 1163.0 | 38.233 |
| 1162.0 | 38.485 |
| 1161.0 | 38.914 |
| 1160.0 | 39.491 |
| 1159.0 | 40.14 |
| 1158.0 | 40.755 |
| 1157.0 | 41.269 |
| 1156.0 | 41.659 |
| 1155.0 | 41.934 |
| 1154.0 | 42.098 |
| 1153.0 | 42.18 |
| 1152.0 | 42.217 |
| 1151.0 | 42.255 |
| 1150.0 | 42.316 |
| 1149.0 | 42.43 |
| 1148.0 | 42.569 |
| 1147.0 | 42.678 |
| 1146.0 | 42.754 |
| 1145.0 | 42.797 |
| 1144.0 | 42.774 |
| 1143.0 | 42.678 |
| 1142.0 | 42.548 |
| 1141.0 | 42.433 |
| 1140.0 | 42.339 |
| 1139.0 | 42.297 |
| 1138.0 | 42.332 |
| 1137.0 | 42.439 |
| 1136.0 | 42.563 |
| 1135.0 | 42.7 |
| 1134.0 | 42.706 |
| 1133.0 | 42.556 |
| 1132.0 | 42.305 |
| 1131.0 | 41.984 |
| 1130.0 | 41.598 |
| 1129.0 | 41.145 |
| 1128.0 | 40.607 |
| 1127.0 | 40.186 |
| 1126.0 | 39.95 |
| 1125.0 | 39.89 |
| 1124.0 | 39.963 |
| 1123.0 | 40.254 |
| 1122.0 | 40.682 |
| 1121.0 | 41.103 |
| 1120.0 | 41.425 |
| 1119.0 | 41.579 |
| 1118.0 | 41.536 |
| 1117.0 | 41.253 |
| 1116.0 | 40.79 |
| 1115.0 | 40.255 |
| 1114.0 | 39.731 |
| 1113.0 | 39.362 |
| 1112.0 | 39.188 |
| 1111.0 | 39.252 |
| 1110.0 | 39.566 |
| 1109.0 | 40.05 |
| 1108.0 | 40.687 |
| 1107.0 | 41.338 |
| 1106.0 | 42 |
| 1105.0 | 42.525 |
| 1104.0 | 42.877 |
| 1103.0 | 43.059 |
| 1102.0 | 43.077 |
| 1101.0 | 43.016 |
| 1100.0 | 42.93 |
| 1099.0 | 42.858 |
| 1098.0 | 42.87 |
| 1097.0 | 42.975 |
| 1096.0 | 43.127 |
| 1095.0 | 43.315 |
| 1094.0 | 43.478 |
| 1093.0 | 43.609 |
| 1092.0 | 43.651 |
| 1091.0 | 43.647 |
| 1090.0 | 43.641 |
| 1089.0 | 43.638 |
| 1088.0 | 43.65 |
| 1087.0 | 43.696 |
| 1086.0 | 43.777 |
| 1085.0 | 43.875 |
| 1084.0 | 43.983 |
| 1083.0 | 44.011 |
| 1082.0 | 43.92 |
| 1081.0 | 43.749 |
| 1080.0 | 43.495 |
| 1079.0 | 43.146 |
| 1078.0 | 42.872 |
| 1077.0 | 42.697 |
| 1076.0 | 42.625 |
| 1075.0 | 42.661 |
| 1074.0 | 42.743 |
| 1073.0 | 42.754 |
| 1072.0 | 42.628 |
| 1071.0 | 42.358 |
| 1070.0 | 41.853 |
| 1069.0 | 41.219 |
| 1068.0 | 40.507 |
| 1067.0 | 39.902 |
| 1066.0 | 39.439 |
| 1065.0 | 39.276 |
| 1064.0 | 39.409 |
| 1063.0 | 39.803 |
| 1062.0 | 40.385 |
| 1061.0 | 40.982 |
| 1060.0 | 41.465 |
| 1059.0 | 41.697 |
| 1058.0 | 41.579 |
| 1057.0 | 41.134 |
| 1056.0 | 40.449 |
| 1055.0 | 39.696 |
| 1054.0 | 39.112 |
| 1053.0 | 38.817 |
| 1052.0 | 38.912 |
| 1051.0 | 39.402 |
| 1050.0 | 40.239 |
| 1049.0 | 41.286 |
| 1048.0 | 42.475 |
| 1047.0 | 43.402 |
| 1046.0 | 44.037 |
| 1045.0 | 44.205 |
| 1044.0 | 43.973 |
| 1043.0 | 43.484 |
| 1042.0 | 42.982 |
| 1041.0 | 42.731 |
| 1040.0 | 42.847 |
| 1039.0 | 43.382 |
| 1038.0 | 44.349 |
| 1037.0 | 45.547 |
| 1036.0 | 46.784 |
| 1035.0 | 47.749 |
| 1034.0 | 48.43 |
| 1033.0 | 48.646 |
| 1032.0 | 48.508 |
| 1031.0 | 48.125 |
| 1030.0 | 47.681 |
| 1029.0 | 47.297 |
| 1028.0 | 47.073 |
| 1027.0 | 46.952 |
| 1026.0 | 46.849 |
| 1025.0 | 46.678 |
| 1024.0 | 46.418 |
| 1023.0 | 46.144 |
| 1022.0 | 45.948 |
| 1021.0 | 45.877 |
| 1020.0 | 46.025 |
| 1019.0 | 46.351 |
| 1018.0 | 46.746 |
| 1017.0 | 46.989 |
| 1016.0 | 46.864 |
| 1015.0 | 46.161 |
| 1014.0 | 44.779 |
| 1013.0 | 42.904 |
| 1012.0 | 40.979 |
| 1011.0 | 39.188 |
| 1010.0 | 37.887 |
| 1009.0 | 37.248 |
| 1008.0 | 37.385 |
| 1007.0 | 38.293 |
| 1006.0 | 39.88 |
| 1005.0 | 41.948 |
| 1004.0 | 44.103 |
| 1003.0 | 45.851 |
| 1002.0 | 46.792 |
| 1001.0 | 46.816 |
| 1000.0 | 46.167 |
| 999.0 | 45.414 |
| 998.0 | 44.983 |
| 997.0 | 45.197 |
| 996.0 | 46.197 |
| 995.0 | 47.937 |
| 994.0 | 50.147 |
| 993.0 | 52.318 |
| 992.0 | 54.18 |
| 991.0 | 55.202 |
| 990.0 | 55.644 |
| 989.0 | 55.691 |
| 988.0 | 55.736 |
| 987.0 | 56.061 |
| 986.0 | 56.648 |
| 985.0 | 57.21 |
| 984.0 | 57.388 |
| 983.0 | 56.914 |
| 982.0 | 55.587 |
| 981.0 | 53.59 |
| 980.0 | 51.435 |
| 979.0 | 49.437 |
| 978.0 | 47.902 |
| 977.0 | 46.953 |
| 976.0 | 46.482 |
| 975.0 | 46.351 |
| 974.0 | 46.213 |
| 973.0 | 45.844 |
| 972.0 | 45.232 |
| 971.0 | 44.489 |
| 970.0 | 43.791 |
| 969.0 | 43.446 |
| 968.0 | 43.632 |
| 967.0 | 44.26 |
| 966.0 | 45.02 |
| 965.0 | 45.324 |
| 964.0 | 44.723 |
| 963.0 | 43.037 |
| 962.0 | 40.503 |
| 961.0 | 37.756 |
| 960.0 | 35.409 |
| 959.0 | 34.274 |
| 958.0 | 34.479 |
| 957.0 | 36.21 |
| 956.0 | 39.176 |
| 955.0 | 42.82 |
| 954.0 | 46.223 |
| 953.0 | 47.895 |
| 952.0 | 47.346 |
| 951.0 | 45.138 |
| 950.0 | 42.259 |
| 949.0 | 40.061 |
| 948.0 | 39.37 |
| 947.0 | 40.729 |
| 946.0 | 44.075 |
| 945.0 | 49.127 |
| 944.0 | 54.684 |
| 943.0 | 58.985 |
| 942.0 | 61.165 |
| 941.0 | 60.882 |
| 940.0 | 59.172 |
| 939.0 | 57.344 |
| 938.0 | 56.672 |
| 937.0 | 57.818 |
| 936.0 | 60.578 |
| 935.0 | 64.289 |
| 934.0 | 67.649 |
| 933.0 | 69.646 |
| 932.0 | 69.966 |
| 931.0 | 68.805 |
| 930.0 | 67.191 |
| 929.0 | 66.209 |
| 928.0 | 66.39 |
| 927.0 | 67.678 |
| 926.0 | 69.264 |
| 925.0 | 70.114 |
| 924.0 | 69.484 |
| 923.0 | 67.196 |
| 922.0 | 64.151 |
| 921.0 | 61.265 |
| 920.0 | 59.23 |
| 919.0 | 58.664 |
| 918.0 | 59.238 |
| 917.0 | 60.33 |
| 916.0 | 61.084 |
| 915.0 | 61.09 |
| 914.0 | 60.373 |
| 913.0 | 59.387 |
| 912.0 | 58.837 |
| 911.0 | 59.33 |
| 910.0 | 61.019 |
| 909.0 | 63.594 |
| 908.0 | 66.61 |
| 907.0 | 69.469 |
| 906.0 | 71.617 |
| 905.0 | 73.1 |
| 904.0 | 74.31 |
| 903.0 | 75.542 |
| 902.0 | 76.81 |
| 901.0 | 78.028 |
| 900.0 | 78.931 |
| 899.0 | 79.287 |
| 898.0 | 79.114 |
| 897.0 | 78.659 |
| 896.0 | 78.283 |
| 895.0 | 78.165 |
| 894.0 | 78.189 |
| 893.0 | 77.991 |
| 892.0 | 77.148 |
| 891.0 | 75.375 |
| 890.0 | 72.819 |
| 889.0 | 69.999 |
| 888.0 | 67.63 |
| 887.0 | 66.155 |
| 886.0 | 65.589 |
| 885.0 | 65.598 |
| 884.0 | 65.467 |
| 883.0 | 64.657 |
| 882.0 | 63.118 |
| 881.0 | 60.978 |
| 880.0 | 58.784 |
| 879.0 | 57.389 |
| 878.0 | 57.131 |
| 877.0 | 57.957 |
| 876.0 | 59.463 |
| 875.0 | 61.087 |
| 874.0 | 62.343 |
| 873.0 | 63.099 |
| 872.0 | 63.692 |
| 871.0 | 64.569 |
| 870.0 | 66.034 |
| 869.0 | 68.193 |
| 868.0 | 70.774 |
| 867.0 | 73.413 |
| 866.0 | 76.007 |
| 865.0 | 78.185 |
| 864.0 | 79.813 |
| 863.0 | 81.156 |
| 862.0 | 82.245 |
| 861.0 | 83.145 |
| 860.0 | 84.698 |
| 859.0 | 87.732 |
| 858.0 | 90.12 |
| 857.0 | 89.5 |
| 856.0 | 86.507 |
| 855.0 | 83.057 |
| 854.0 | 80.623 |
| 853.0 | 79.197 |
| 852.0 | 77.739 |
| 851.0 | 74.807 |
| 850.0 | 69.696 |
| 849.0 | 63.19 |
| 848.0 | 56.729 |
| 847.0 | 51.429 |
| 846.0 | 47.881 |
| 845.0 | 45.929 |
| 844.0 | 44.997 |
| 843.0 | 44.598 |
| 842.0 | 44.39 |
| 841.0 | 44.16 |
| 840.0 | 43.83 |
| 839.0 | 43.448 |
| 838.0 | 42.987 |
| 837.0 | 42.402 |
| 836.0 | 41.764 |
| 835.0 | 41.192 |
| 834.0 | 40.946 |
| 833.0 | 41.222 |
| 832.0 | 41.982 |
| 831.0 | 43.103 |
| 830.0 | 44.207 |
| 829.0 | 44.873 |
| 828.0 | 44.988 |
| 827.0 | 44.8 |
| 826.0 | 44.885 |
| 825.0 | 45.863 |
| 824.0 | 47.957 |
| 823.0 | 50.948 |
| 822.0 | 54.327 |
| 821.0 | 57.336 |
| 820.0 | 59.431 |
| 819.0 | 60.805 |
| 818.0 | 62.232 |
| 817.0 | 64.614 |
| 816.0 | 68.561 |
| 815.0 | 74.044 |
| 814.0 | 80.071 |
| 813.0 | 85.421 |
| 812.0 | 89.093 |
| 811.0 | 90.754 |
| 810.0 | 91.04 |
| 809.0 | 90.879 |
| 808.0 | 91.048 |
| 807.0 | 91.849 |
| 806.0 | 93.114 |
| 805.0 | 94.516 |
| 804.0 | 95.922 |
| 803.0 | 97.105 |
| 802.0 | 97.992 |
| 801.0 | 98.684 |
| 800.0 | 99.094 |
| 799.0 | 99.229 |
| 798.0 | 99.302 |
| 797.0 | 99.283 |
| 796.0 | 99.152 |
| 795.0 | 99.068 |
| 794.0 | 98.971 |
| 793.0 | 98.908 |
| 792.0 | 98.912 |
| 791.0 | 98.969 |
| 790.0 | 98.986 |
| 789.0 | 99.034 |
| 788.0 | 98.999 |
| 787.0 | 98.842 |
| 786.0 | 98.676 |
| 785.0 | 98.5 |
| 784.0 | 98.341 |
| 783.0 | 98.409 |
| 782.0 | 98.616 |
| 781.0 | 98.853 |
| 780.0 | 99.093 |
| 779.0 | 99.133 |
| 778.0 | 98.899 |
| 777.0 | 98.702 |
| 776.0 | 98.626 |
| 775.0 | 98.65 |
| 774.0 | 98.847 |
| 773.0 | 99.074 |
| 772.0 | 99.148 |
| 771.0 | 99.156 |
| 770.0 | 99.055 |
| 769.0 | 98.894 |
| 768.0 | 98.91 |
| 767.0 | 99.019 |
| 766.0 | 99.132 |
| 765.0 | 99.252 |
| 764.0 | 99.195 |
| 763.0 | 98.924 |
| 762.0 | 98.568 |
| 761.0 | 98.245 |
| 760.0 | 98.047 |
| 759.0 | 98.262 |
| 758.0 | 98.658 |
| 757.0 | 98.929 |
| 756.0 | 99.015 |
| 755.0 | 98.824 |
| 754.0 | 98.491 |
| 753.0 | 98.456 |
| 752.0 | 98.617 |
| 751.0 | 98.886 |
| 750.0 | 99.161 |
| 749.0 | 99.237 |
| 748.0 | 99.003 |
| 747.0 | 98.846 |
| 746.0 | 98.727 |
| 745.0 | 98.701 |
| 744.0 | 98.887 |
| 743.0 | 99.088 |
| 742.0 | 99.198 |
| 741.0 | 99.222 |
| 740.0 | 98.939 |
| 739.0 | 98.446 |
| 738.0 | 98.141 |
| 737.0 | 98.176 |
| 736.0 | 98.494 |
| 735.0 | 98.998 |
| 734.0 | 99.287 |
| 733.0 | 99.277 |
| 732.0 | 99.25 |
| 731.0 | 99.261 |
| 730.0 | 99.184 |
| 729.0 | 99.104 |
| 728.0 | 98.865 |
| 727.0 | 98.631 |
| 726.0 | 98.753 |
| 725.0 | 99.092 |
| 724.0 | 99.263 |
| 723.0 | 99.306 |
| 722.0 | 99.138 |
| 721.0 | 99.036 |
| 720.0 | 99.207 |
| 719.0 | 99.356 |
| 718.0 | 99.225 |
| 717.0 | 99.017 |
| 716.0 | 98.927 |
| 715.0 | 99.016 |
| 714.0 | 99.295 |
| 713.0 | 99.345 |
| 712.0 | 99.133 |
| 711.0 | 99.088 |
| 710.0 | 99.183 |
| 709.0 | 99.32 |
| 708.0 | 99.367 |
| 707.0 | 99.191 |
| 706.0 | 99.007 |
| 705.0 | 99.175 |
| 704.0 | 99.427 |
| 703.0 | 99.35 |
| 702.0 | 99.185 |
| 701.0 | 99.086 |
| 700.0 | 99.109 |
| 699.0 | 99.367 |
| 698.0 | 99.428 |
| 697.0 | 99.284 |
| 696.0 | 99.278 |
| 695.0 | 99.357 |
| 694.0 | 99.342 |
| 693.0 | 99.292 |
| 692.0 | 99.212 |
| 691.0 | 99.144 |
| 690.0 | 99.325 |
| 689.0 | 99.328 |
| 688.0 | 99.076 |
| 687.0 | 99.046 |
| 686.0 | 99.184 |
| 685.0 | 99.265 |
| 684.0 | 99.109 |
| 683.0 | 98.85 |
| 682.0 | 98.768 |
| 681.0 | 99.128 |
| 680.0 | 99.305 |
| 679.0 | 99.125 |
| 678.0 | 99.039 |
| 677.0 | 99.111 |
| 676.0 | 99.217 |
| 675.0 | 99.279 |
| 674.0 | 99.122 |
| 673.0 | 99.074 |
| 672.0 | 99.256 |
| 671.0 | 99.129 |
| 670.0 | 98.673 |
| 669.0 | 98.515 |
| 668.0 | 98.81 |
| 667.0 | 99.182 |
| 666.0 | 99.153 |
| 665.0 | 98.916 |
| 664.0 | 98.901 |
| 663.0 | 99.152 |
| 662.0 | 99.161 |
| 661.0 | 98.887 |
| 660.0 | 98.889 |
| 659.0 | 99.091 |
| 658.0 | 99.089 |
| 657.0 | 98.927 |
| 656.0 | 98.824 |
| 655.0 | 98.936 |
| 654.0 | 99.148 |
| 653.0 | 99.073 |
| 652.0 | 98.917 |
| 651.0 | 99.131 |
| 650.0 | 98.027 |
| 649.0 | 98.291 |
| 648.0 | 98.387 |
| 647.0 | 98.238 |
| 646.0 | 98.172 |
| 645.0 | 97.662 |
| 644.0 | 99.264 |
| 643.0 | 98.648 |
| 642.0 | 98.354 |
| 641.0 | 98.933 |
| 640.0 | 97.819 |
| 639.0 | 98.512 |
| 638.0 | 98.324 |
| 637.0 | 97.725 |
| 636.0 | 98.707 |
| 635.0 | 98.885 |
| 634.0 | 97.338 |
| 633.0 | 97.717 |
| 632.0 | 98.321 |
| 631.0 | 98.033 |
| 630.0 | 97.837 |
| 629.0 | 98.107 |
| 628.0 | 98.622 |
| 627.0 | 99.086 |
| 626.0 | 98.635 |
| 625.0 | 98.578 |
| 624.0 | 98.927 |
| 623.0 | 98.234 |
| 622.0 | 98.398 |
| 621.0 | 98.95 |
| 620.0 | 98.604 |
| 619.0 | 98.155 |
| 618.0 | 97.785 |
| 617.0 | 98.596 |
| 616.0 | 98.002 |
| 615.0 | 97.075 |
| 614.0 | 97.744 |
| 613.0 | 98.996 |
| 612.0 | 98.681 |
| 611.0 | 98.469 |
| 610.0 | 98.29 |
| 609.0 | 98.484 |
| 608.0 | 98.5 |
| 607.0 | 98.129 |
| 606.0 | 98.794 |
| 605.0 | 98.472 |
| 604.0 | 97.307 |
| 603.0 | 98.76 |
| 602.0 | 98.678 |
| 601.0 | 98.113 |
| 600.0 | 98.66 |
| 599.0 | 98.892 |
| 598.0 | 97.684 |
| 597.0 | 97.944 |
| 596.0 | 98.704 |
| 595.0 | 98.692 |
| 594.0 | 98.411 |
| 593.0 | 98.433 |
| 592.0 | 99.071 |
| 591.0 | 97.945 |
| 590.0 | 97.879 |
| 589.0 | 98.744 |
| 588.0 | 98.021 |
| 587.0 | 97.929 |
| 586.0 | 99.048 |
| 585.0 | 98.043 |
| 584.0 | 98.047 |
| 583.0 | 98.524 |
| 582.0 | 98.598 |
| 581.0 | 98.077 |
| 580.0 | 98.349 |
| 579.0 | 99.057 |
| 578.0 | 98.657 |
| 577.0 | 99.03 |
| 576.0 | 99.214 |
| 575.0 | 98.274 |
| 574.0 | 98.344 |
| 573.0 | 98.615 |
| 572.0 | 98.154 |
| 571.0 | 98.074 |
| 570.0 | 98.705 |
| 569.0 | 98.115 |
| 568.0 | 98.493 |
| 567.0 | 98.409 |
| 566.0 | 98.284 |
| 565.0 | 98.771 |
| 564.0 | 98.546 |
| 563.0 | 97.538 |
| 562.0 | 98.358 |
| 561.0 | 98.812 |
| 560.0 | 98.286 |
| 559.0 | 98.301 |
| 558.0 | 98.078 |
| 557.0 | 97.142 |
| 556.0 | 98.232 |
| 555.0 | 98.584 |
| 554.0 | 98.043 |
| 553.0 | 98.498 |
| 552.0 | 98.191 |
| 551.0 | 97.773 |
| 550.0 | 98.851 |
| 549.0 | 97.751 |
| 548.0 | 97.874 |
| 547.0 | 98.106 |
| 546.0 | 96.883 |
| 545.0 | 97.576 |
| 544.0 | 97.975 |
| 543.0 | 96.93 |
| 542.0 | 98.052 |
| 541.0 | 97.56 |
| 540.0 | 96.79 |
| 539.0 | 97.876 |
| 538.0 | 96.984 |
| 537.0 | 97.507 |
| 536.0 | 97.656 |
| 535.0 | 96.31 |
| 534.0 | 97.782 |
| 533.0 | 97.087 |
| 532.0 | 96.04 |
| 531.0 | 97.499 |
| 530.0 | 96.492 |
| 529.0 | 97.15 |
| 528.0 | 96.865 |
| 527.0 | 96.302 |
| 526.0 | 97.081 |
| 525.0 | 95.361 |
| 524.0 | 96.139 |
| 523.0 | 95.388 |
| 522.0 | 95.357 |
| 521.0 | 96.205 |
| 520.0 | 94.362 |
| 519.0 | 95.469 |
| 518.0 | 94.831 |
| 517.0 | 95.184 |
| 516.0 | 95.508 |
| 515.0 | 94.332 |
| 514.0 | 95.937 |
| 513.0 | 94.26 |
| 512.0 | 95.053 |
| 511.0 | 94.636 |
| 510.0 | 94.67 |
| 509.0 | 97.068 |
| 508.0 | 96.775 |
| 507.0 | 96.923 |
| 506.0 | 96.063 |
| 505.0 | 96.258 |
| 504.0 | 95.75 |
| 503.0 | 96.38 |
| 502.0 | 95.228 |
| 501.0 | 94.768 |
| 500.0 | 92.368 |
| 499.0 | 89.922 |
| 498.0 | 83.678 |
| 497.0 | 15.372 |
| 496.0 | 9.764 |
| 495.0 | 2.897 |
| 494.0 | 0.062 |
| 493.0 | 0.006 |
| 492.0 | 0.001 |
| 491.0 | 0 |
| 490.0 | 0 |
| 489.0 | 0 |
| 488.0 | 0 |
| 487.0 | 0.001 |
| 486.0 | 0.004 |
| 485.0 | 0.031 |
| 484.0 | 1.319 |
| 483.0 | 8.592 |
| 482.0 | 81.67 |
| 481.0 | 95.395 |
| 480.0 | 95.83 |
| 479.0 | 96.431 |
| 478.0 | 96.673 |
| 477.0 | 96.996 |
| 476.0 | 97.621 |
| 475.0 | 97.596 |
| 474.0 | 97.667 |
| 473.0 | 97.525 |
| 472.0 | 97.761 |
| 471.0 | 97.52 |
| 470.0 | 97.089 |
| 469.0 | 97.293 |
| 468.0 | 96.316 |
| 467.0 | 95.469 |
| 466.0 | 95.502 |
| 465.0 | 95.877 |
| 464.0 | 96.129 |
| 463.0 | 96.364 |
| 462.0 | 96.418 |
| 461.0 | 95.845 |
| 460.0 | 96.178 |
| 459.0 | 96.222 |
| 458.0 | 96.473 |
| 457.0 | 96.144 |
| 456.0 | 96.192 |
| 455.0 | 96.195 |
| 454.0 | 96.206 |
| 453.0 | 97.056 |
| 452.0 | 97.111 |
| 451.0 | 97.219 |
| 450.0 | 97.22 |
| 449.0 | 96.993 |
| 448.0 | 97.097 |
| 447.0 | 96.803 |
| 446.0 | 96.946 |
| 445.0 | 97.19 |
| 444.0 | 96.86 |
| 443.0 | 96.925 |
| 442.0 | 97.204 |
| 441.0 | 97.283 |
| 440.0 | 97.267 |
| 439.0 | 97.189 |
| 438.0 | 96.709 |
| 437.0 | 96.518 |
| 436.0 | 96.778 |
| 435.0 | 97.077 |
| 434.0 | 97.218 |
| 433.0 | 97.202 |
| 432.0 | 96.687 |
| 431.0 | 96.777 |
| 430.0 | 97.07 |
| 429.0 | 97.061 |
| 428.0 | 97.04 |
| 427.0 | 96.996 |
| 426.0 | 96.96 |
| 425.0 | 97.005 |
| 424.0 | 97.305 |
| 423.0 | 97.269 |
| 422.0 | 97.058 |
| 421.0 | 97.062 |
| 420.0 | 96.767 |
| 419.0 | 97.1 |
| 418.0 | 96.919 |
| 417.0 | 96.869 |
| 416.0 | 97.227 |
| 415.0 | 96.649 |
| 414.0 | 96.128 |
| 413.0 | 96.38 |
| 412.0 | 96.632 |
| 411.0 | 96.859 |
| 410.0 | 96.555 |
| 409.0 | 96.251 |
| 408.0 | 96.139 |
| 407.0 | 96.08 |
| 406.0 | 96.073 |
| 405.0 | 95.723 |
| 404.0 | 95.5 |
| 403.0 | 95.248 |
| 402.0 | 95.179 |
| 401.0 | 95.265 |
| 400.0 | 94.87 |
| 399.0 | 94.928 |
| 398.0 | 94.679 |
| 397.0 | 94.536 |
| 396.0 | 94.165 |
| 395.0 | 93.694 |
| 394.0 | 93.356 |
| 393.0 | 92.931 |
| 392.0 | 91.647 |
| 391.0 | 89.104 |
| 390.0 | 86.503 |
| 389.0 | 84.326 |
| 388.0 | 80.629 |
| 387.0 | 74.706 |
| 386.0 | 68.509 |
| 385.0 | 62.437 |
| 384.0 | 56.644 |
| 383.0 | 50.675 |
| 382.0 | 42.434 |
| 381.0 | 34.114 |
| 380.0 | 29.535 |
| 379.0 | 26.579 |
| 378.0 | 22.825 |
| 377.0 | 21.423 |
| 376.0 | 20.396 |
| 375.0 | 16.125 |
| 374.0 | 11.362 |
| 373.0 | 9.264 |
| 372.0 | 8.09 |
| 371.0 | 5.894 |
| 370.0 | 3.856 |
| 369.0 | 2.723 |
| 368.0 | 1.848 |
| 367.0 | 1.211 |
| 366.0 | 0.894 |
| 365.0 | 0.602 |
| 364.0 | 0.336 |
| 363.0 | 0.179 |
| 362.0 | 0.09 |
| 361.0 | 0.043 |
| 360.0 | 0.018 |
| 359.0 | 0.003 |
| 358.0 | 0.003 |
| 357.0 | 0.002 |
| 356.0 | 0.004 |
| 355.0 | 0.001 |
| 354.0 | 0 |
| 353.0 | 0.003 |
| 352.0 | 0.004 |
| 351.0 | 0.002 |
| 350.0 | 0.004 |
| 349.0 | 0.001 |
| 348.0 | 0 |
| 347.0 | 0.003 |
| 346.0 | 0.005 |
| 345.0 | 0.002 |
| 344.0 | 0.004 |
| 343.0 | 0.002 |
| 342.0 | 0.001 |
| 341.0 | 0.003 |
| 340.0 | 0.005 |
| 339.0 | 0.001 |
| 338.0 | 0.005 |
| 337.0 | 0 |
| 336.0 | 0.002 |
| 335.0 | 0.003 |
| 334.0 | 0.005 |
| 333.0 | 0.004 |
| 332.0 | 0.005 |
| 331.0 | 0.005 |
| 330.0 | 0.003 |
| 329.0 | 0.003 |
| 328.0 | 0.005 |
| 327.0 | 0.001 |
| 326.0 | 0.004 |
| 325.0 | 0 |
| 324.0 | 0.001 |
| 323.0 | 0.003 |
| 322.0 | 0.005 |
| 321.0 | 0.002 |
| 320.0 | 0.005 |
| 319.0 | 0 |
| 318.0 | 0.004 |
| 317.0 | 0.005 |
| 316.0 | 0.004 |
| 315.0 | 0.005 |
| 314.0 | 0.002 |
| 313.0 | 0 |
| 312.0 | 0.001 |
| 311.0 | 0.004 |
| 310.0 | 0.004 |
| 309.0 | 0.002 |
| 308.0 | 0.003 |
| 307.0 | 0 |
| 306.0 | 0 |
| 305.0 | 0.004 |
| 304.0 | 0.004 |
| 303.0 | 0.001 |
| 302.0 | 0.003 |
| 301.0 | 0.001 |
| 300.0 | 0 |
| 299.0 | 0.004 |
| 298.0 | 0.005 |
| 297.0 | 0.004 |
| 296.0 | 0.003 |
| 295.0 | 0 |
| 294.0 | 0 |
| 293.0 | 0.003 |
| 292.0 | 0.005 |
| 291.0 | 0.003 |
| 290.0 | 0.004 |
| 289.0 | 0 |
| 288.0 | 0.003 |
| 287.0 | 0.003 |
| 286.0 | 0.005 |
| 285.0 | 0.003 |
| 284.0 | 0.004 |
| 283.0 | 0 |
| 282.0 | 0.002 |
| 281.0 | 0.003 |
| 280.0 | 0.006 |
| 279.0 | 0 |
| 278.0 | 0.006 |
| 277.0 | 0.001 |
| 276.0 | 0.004 |
| 275.0 | 0.003 |
| 274.0 | 0.006 |
| 273.0 | 0.004 |
| 272.0 | 0.004 |
| 271.0 | 0 |
| 270.0 | 0.002 |
| 269.0 | 0.004 |
| 268.0 | 0.005 |
| 267.0 | 0 |
| 266.0 | 0.001 |
| 265.0 | 0.001 |
| 264.0 | 0.001 |
| 263.0 | 0.005 |
| 262.0 | 0.006 |
| 261.0 | 0.001 |
| 260.0 | 0.005 |
| 259.0 | 0 |
| 258.0 | 0.001 |
| 257.0 | 0.005 |
| 256.0 | 0.005 |
| 255.0 | 0.001 |
| 254.0 | 0.005 |
| 253.0 | 0.001 |
| 252.0 | 0.001 |
| 251.0 | 0.006 |
| 250.0 | 0.006 |
| 249.0 | 0.004 |
| 248.0 | 0.004 |
| 247.0 | 0.001 |
| 246.0 | 0 |
| 245.0 | 0.005 |
| 244.0 | 0.004 |
| 243.0 | 0.006 |
| 242.0 | 0.004 |
| 241.0 | 0.001 |
| 240.0 | 0 |
| 239.0 | 0.006 |
| 238.0 | 0.004 |
| 237.0 | 0.002 |
| 236.0 | 0.005 |
| 235.0 | 0.001 |
| 234.0 | 0.001 |
| 233.0 | 0.006 |
| 232.0 | 0.004 |
| 231.0 | 0.005 |
| 230.0 | 0.004 |
| 229.0 | 0.001 |
| 228.0 | 0.001 |
| 227.0 | 0.007 |
| 226.0 | 0.004 |
| 225.0 | 0.002 |
| 224.0 | 0.003 |
| 223.0 | 0.001 |
| 222.0 | 0.001 |
| 221.0 | 0.006 |
| 220.0 | 0.005 |
| 219.0 | 0.005 |
| 218.0 | 0.003 |
| 217.0 | 0.003 |
| 216.0 | 0.001 |
| 215.0 | 0.005 |
| 214.0 | 0.004 |
| 213.0 | 0.005 |
| 212.0 | 0.005 |
| 211.0 | 0.002 |
| 210.0 | 0.003 |
| 209.0 | 0.005 |
| 208.0 | 0.005 |
| 207.0 | 0.004 |
| 206.0 | 0.006 |
| 205.0 | 0.002 |
| 204.0 | 0.003 |
| 203.0 | 0.008 |
| 202.0 | 0.009 |
| 201.0 | 0.009 |
| 200.0 | 0.009 |